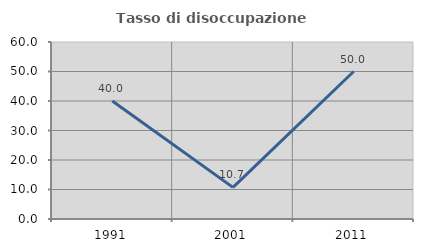
| Category | Tasso di disoccupazione giovanile  |
|---|---|
| 1991.0 | 40 |
| 2001.0 | 10.714 |
| 2011.0 | 50 |